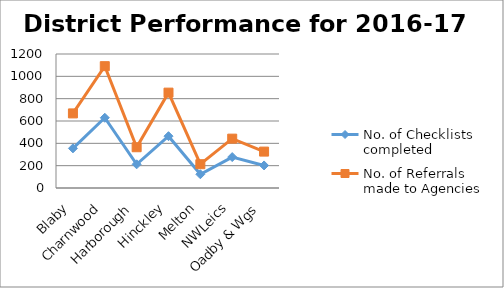
| Category | No. of Checklists completed | No. of Referrals made to Agencies |
|---|---|---|
| Blaby  | 355 | 668 |
| Charnwood | 629 | 1091 |
| Harborough | 212 | 365 |
| Hinckley | 464 | 854 |
| Melton | 123 | 213 |
| NWLeics | 277 | 442 |
| Oadby & Wgs | 202 | 326 |